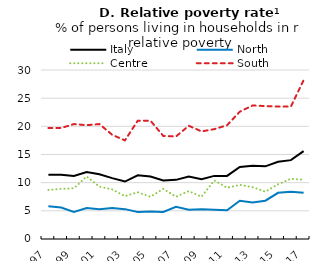
| Category | Italy | North | Centre | South |
|---|---|---|---|---|
| 1997.0 | 11.4 | 5.8 | 8.7 | 19.7 |
| 1998.0 | 11.4 | 5.6 | 8.9 | 19.7 |
| 1999.0 | 11.2 | 4.8 | 9 | 20.4 |
| 2000.0 | 11.9 | 5.5 | 11.1 | 20.2 |
| 2001.0 | 11.5 | 5.3 | 9.3 | 20.4 |
| 2002.0 | 10.8 | 5.5 | 8.8 | 18.5 |
| 2003.0 | 10.2 | 5.3 | 7.6 | 17.5 |
| 2004.0 | 11.3 | 4.8 | 8.3 | 21 |
| 2005.0 | 11.1 | 4.9 | 7.5 | 21 |
| 2006.0 | 10.4 | 4.8 | 8.9 | 18.3 |
| 2007.0 | 10.5 | 5.7 | 7.5 | 18.2 |
| 2008.0 | 11.1 | 5.2 | 8.5 | 20.1 |
| 2009.0 | 10.6 | 5.3 | 7.5 | 19.1 |
| 2010.0 | 11.2 | 5.2 | 10.4 | 19.5 |
| 2011.0 | 11.2 | 5.1 | 9.1 | 20.2 |
| 2012.0 | 12.8 | 6.8 | 9.6 | 22.6 |
| 2013.0 | 13 | 6.5 | 9.2 | 23.7 |
| 2014.0 | 12.9 | 6.8 | 8.4 | 23.6 |
| 2015.0 | 13.7 | 8.2 | 9.7 | 23.5 |
| 2016.0 | 14 | 8.4 | 10.7 | 23.5 |
| 2017.0 | 15.6 | 8.2 | 10.5 | 28.2 |